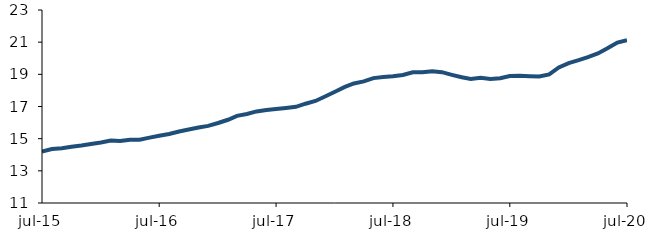
| Category | Series 0 |
|---|---|
| 2015-07-01 | 14.206 |
| 2015-08-01 | 14.352 |
| 2015-09-01 | 14.407 |
| 2015-10-01 | 14.496 |
| 2015-11-01 | 14.573 |
| 2015-12-01 | 14.669 |
| 2016-01-01 | 14.766 |
| 2016-02-01 | 14.879 |
| 2016-03-01 | 14.849 |
| 2016-04-01 | 14.939 |
| 2016-05-01 | 14.93 |
| 2016-06-01 | 15.066 |
| 2016-07-01 | 15.186 |
| 2016-08-01 | 15.293 |
| 2016-09-01 | 15.449 |
| 2016-10-01 | 15.566 |
| 2016-11-01 | 15.698 |
| 2016-12-01 | 15.796 |
| 2017-01-01 | 15.974 |
| 2017-02-01 | 16.176 |
| 2017-03-01 | 16.42 |
| 2017-04-01 | 16.537 |
| 2017-05-01 | 16.695 |
| 2017-06-01 | 16.777 |
| 2017-07-01 | 16.841 |
| 2017-08-01 | 16.91 |
| 2017-09-01 | 16.98 |
| 2017-10-01 | 17.174 |
| 2017-11-01 | 17.344 |
| 2017-12-01 | 17.621 |
| 2018-01-01 | 17.918 |
| 2018-02-01 | 18.22 |
| 2018-03-01 | 18.431 |
| 2018-04-01 | 18.559 |
| 2018-05-01 | 18.766 |
| 2018-06-01 | 18.833 |
| 2018-07-01 | 18.886 |
| 2018-08-01 | 18.959 |
| 2018-09-01 | 19.129 |
| 2018-10-01 | 19.123 |
| 2018-11-01 | 19.192 |
| 2018-12-01 | 19.134 |
| 2019-01-01 | 18.969 |
| 2019-02-01 | 18.815 |
| 2019-03-01 | 18.715 |
| 2019-04-01 | 18.791 |
| 2019-05-01 | 18.716 |
| 2019-06-01 | 18.759 |
| 2019-07-01 | 18.892 |
| 2019-08-01 | 18.915 |
| 2019-09-01 | 18.887 |
| 2019-10-01 | 18.865 |
| 2019-11-01 | 18.992 |
| 2019-12-01 | 19.428 |
| 2020-01-01 | 19.702 |
| 2020-02-01 | 19.883 |
| 2020-03-01 | 20.074 |
| 2020-04-01 | 20.3 |
| 2020-05-01 | 20.616 |
| 2020-06-01 | 20.971 |
| 2020-07-01 | 21.125 |